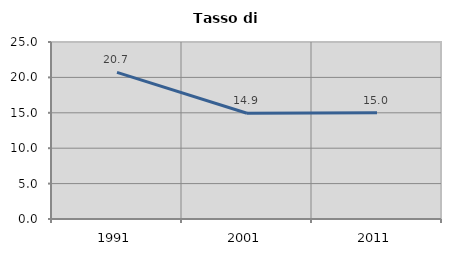
| Category | Tasso di disoccupazione   |
|---|---|
| 1991.0 | 20.712 |
| 2001.0 | 14.937 |
| 2011.0 | 15 |